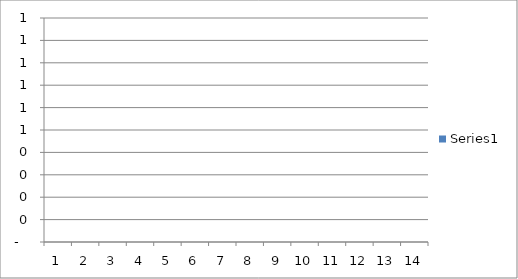
| Category | Series 0 |
|---|---|
| 0 | 0 |
| 1 | 0 |
| 2 | 0 |
| 3 | 0 |
| 4 | 0 |
| 5 | 0 |
| 6 | 0 |
| 7 | 0 |
| 8 | 0 |
| 9 | 0 |
| 10 | 0 |
| 11 | 0 |
| 12 | 0 |
| 13 | 0 |